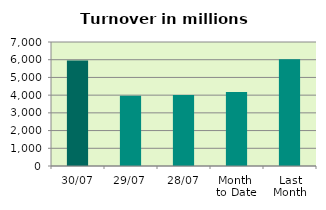
| Category | Series 0 |
|---|---|
| 30/07 | 5953.172 |
| 29/07 | 3958.875 |
| 28/07 | 4009.785 |
| Month 
to Date | 4174.501 |
| Last
Month | 6026.772 |